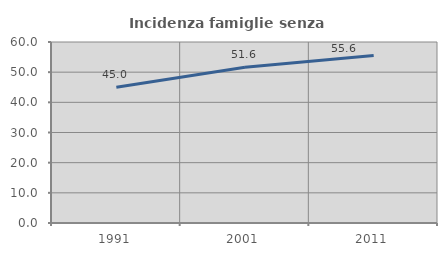
| Category | Incidenza famiglie senza nuclei |
|---|---|
| 1991.0 | 45 |
| 2001.0 | 51.613 |
| 2011.0 | 55.556 |